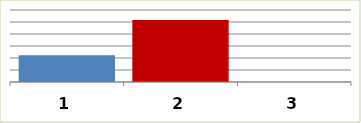
| Category | Series 0 |
|---|---|
| 0 | 111723128 |
| 1 | 258435005 |
| 2 | 0 |